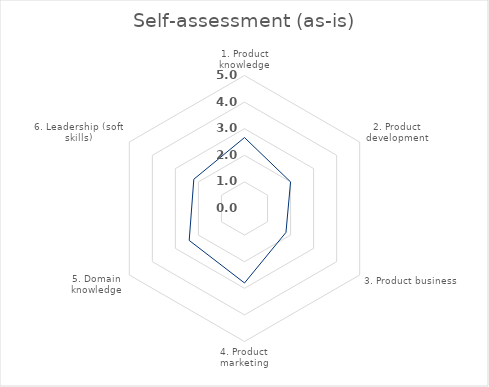
| Category | Self-assessment (as-is) |
|---|---|
| 1. Product knowledge | 2.667 |
| 2. Product development | 2 |
| 3. Product business | 1.8 |
| 4. Product marketing | 2.8 |
| 5. Domain knowledge | 2.4 |
| 6. Leadership (soft skills) | 2.2 |